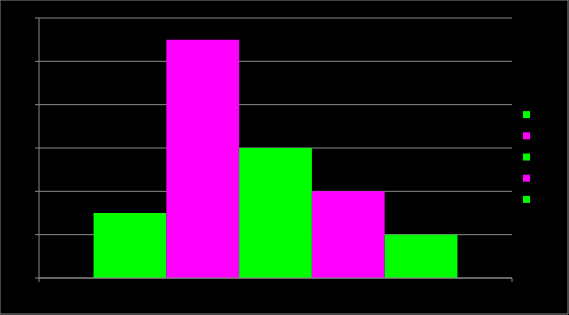
| Category | 0 | 1 | 2 | 33 | 4 |
|---|---|---|---|---|---|
| 0 | 3 | 11 | 6 | 4 | 2 |